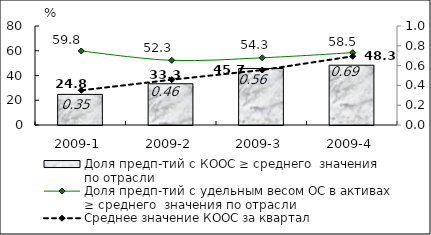
| Category | Доля предп-тий с КООС ≥ среднего  значения по отрасли |
|---|---|
| 2009-1 | 24.75 |
| 2009-2 | 33.33 |
| 2009-3 | 45.69 |
| 2009-4 | 48.31 |